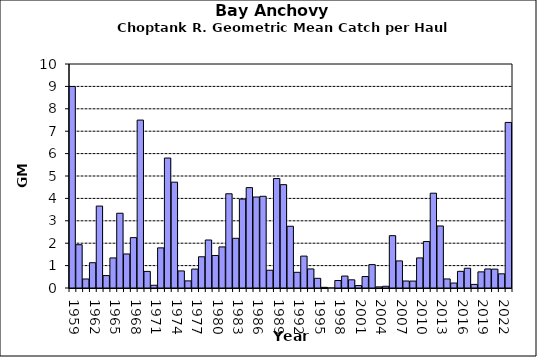
| Category | Series 0 |
|---|---|
| 1959.0 | 8.996 |
| 1960.0 | 1.934 |
| 1961.0 | 0.403 |
| 1962.0 | 1.129 |
| 1963.0 | 3.658 |
| 1964.0 | 0.554 |
| 1965.0 | 1.342 |
| 1966.0 | 3.338 |
| 1967.0 | 1.52 |
| 1968.0 | 2.248 |
| 1969.0 | 7.496 |
| 1970.0 | 0.741 |
| 1971.0 | 0.122 |
| 1972.0 | 1.791 |
| 1973.0 | 5.802 |
| 1974.0 | 4.725 |
| 1975.0 | 0.762 |
| 1976.0 | 0.318 |
| 1977.0 | 0.844 |
| 1978.0 | 1.394 |
| 1979.0 | 2.142 |
| 1980.0 | 1.452 |
| 1981.0 | 1.834 |
| 1982.0 | 4.206 |
| 1983.0 | 2.218 |
| 1984.0 | 3.97 |
| 1985.0 | 4.481 |
| 1986.0 | 4.062 |
| 1987.0 | 4.093 |
| 1988.0 | 0.794 |
| 1989.0 | 4.886 |
| 1990.0 | 4.614 |
| 1991.0 | 2.756 |
| 1992.0 | 0.7 |
| 1993.0 | 1.424 |
| 1994.0 | 0.851 |
| 1995.0 | 0.432 |
| 1996.0 | 0.029 |
| 1997.0 | 0 |
| 1998.0 | 0.335 |
| 1999.0 | 0.534 |
| 2000.0 | 0.365 |
| 2001.0 | 0.109 |
| 2002.0 | 0.513 |
| 2003.0 | 1.045 |
| 2004.0 | 0.05 |
| 2005.0 | 0.078 |
| 2006.0 | 2.337 |
| 2007.0 | 1.209 |
| 2008.0 | 0.313 |
| 2009.0 | 0.31 |
| 2010.0 | 1.343 |
| 2011.0 | 2.075 |
| 2012.0 | 4.232 |
| 2013.0 | 2.769 |
| 2014.0 | 0.404 |
| 2015.0 | 0.221 |
| 2016.0 | 0.744 |
| 2017.0 | 0.882 |
| 2018.0 | 0.161 |
| 2019.0 | 0.72 |
| 2020.0 | 0.85 |
| 2021.0 | 0.842 |
| 2022.0 | 0.633 |
| 2023.0 | 7.391 |